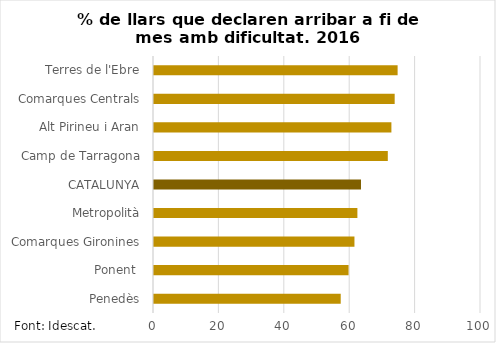
| Category | Amb dificultat |
|---|---|
| Penedès | 57.1 |
| Ponent  | 59.5 |
| Comarques Gironines | 61.3 |
| Metropolità | 62.2 |
| CATALUNYA | 63.3 |
| Camp de Tarragona | 71.5 |
| Alt Pirineu i Aran | 72.6 |
| Comarques Centrals | 73.6 |
| Terres de l'Ebre | 74.5 |